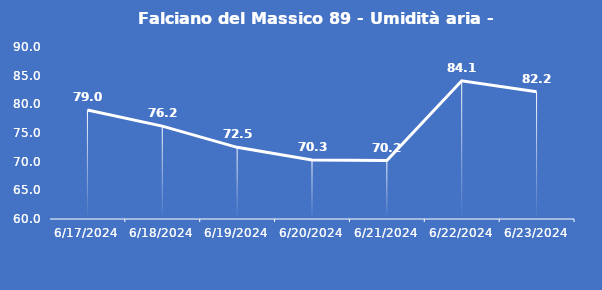
| Category | Falciano del Massico 89 - Umidità aria - Grezzo (%) |
|---|---|
| 6/17/24 | 79 |
| 6/18/24 | 76.2 |
| 6/19/24 | 72.5 |
| 6/20/24 | 70.3 |
| 6/21/24 | 70.2 |
| 6/22/24 | 84.1 |
| 6/23/24 | 82.2 |